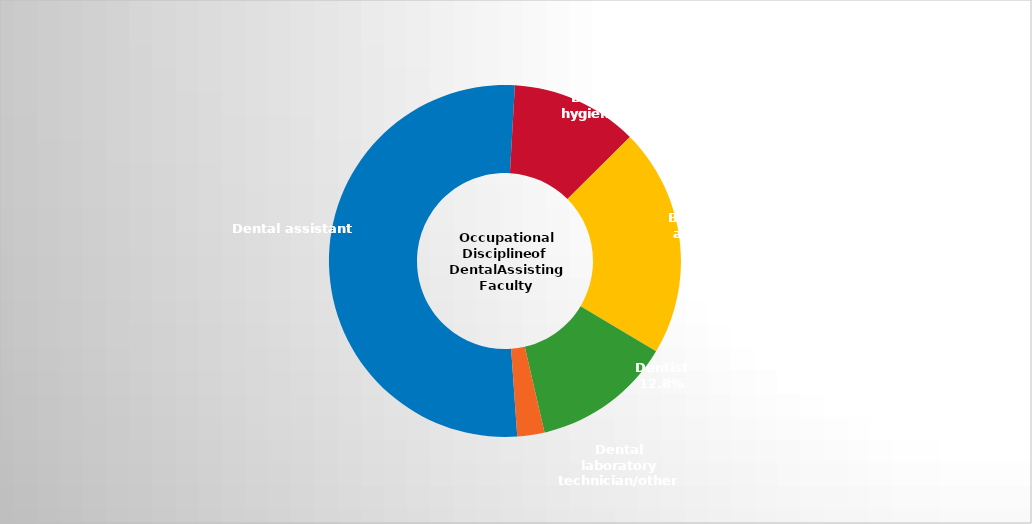
| Category | Series 2 |
|---|---|
| Dental assistant   | 0.52 |
| Dental hygienist | 0.117 |
| Both dental hygienist and dental assistant | 0.21 |
| Dentist | 0.128 |
| Dental laboratory technician/other | 0.025 |